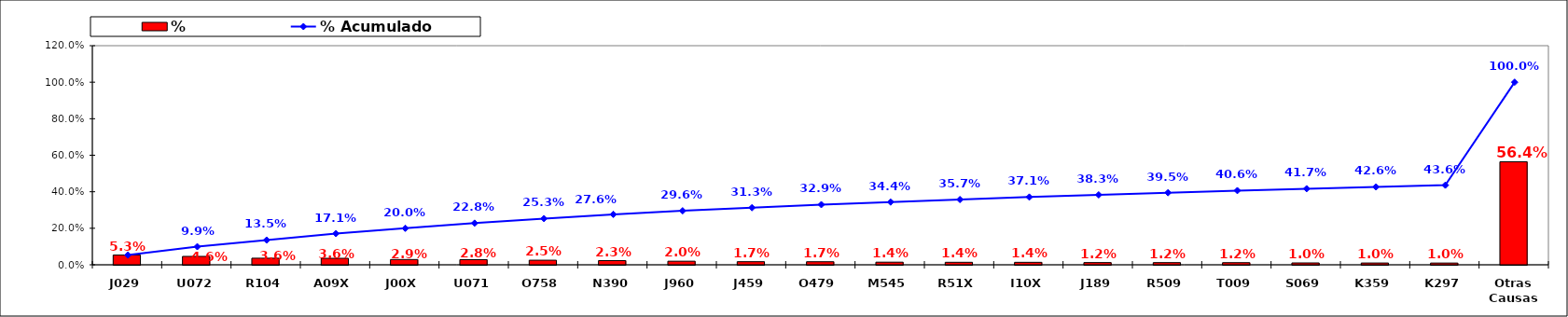
| Category | % |
|---|---|
| J029 | 0.053 |
| U072 | 0.046 |
| R104 | 0.036 |
| A09X | 0.036 |
| J00X | 0.029 |
| U071 | 0.028 |
| O758 | 0.025 |
| N390 | 0.023 |
| J960 | 0.02 |
| J459 | 0.017 |
| O479 | 0.017 |
| M545 | 0.014 |
| R51X | 0.014 |
| I10X | 0.014 |
| J189 | 0.012 |
| R509 | 0.012 |
| T009 | 0.012 |
| S069 | 0.01 |
| K359 | 0.01 |
| K297 | 0.01 |
| Otras Causas | 0.564 |